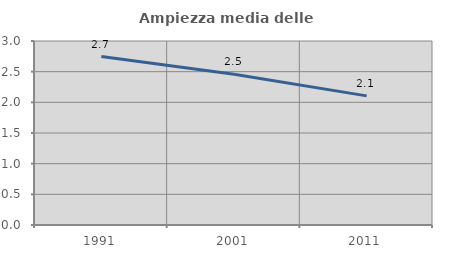
| Category | Ampiezza media delle famiglie |
|---|---|
| 1991.0 | 2.746 |
| 2001.0 | 2.457 |
| 2011.0 | 2.105 |